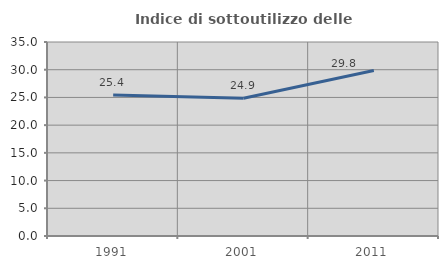
| Category | Indice di sottoutilizzo delle abitazioni  |
|---|---|
| 1991.0 | 25.417 |
| 2001.0 | 24.852 |
| 2011.0 | 29.843 |